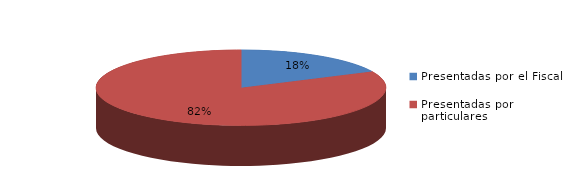
| Category | Series 0 |
|---|---|
| Presentadas por el Fiscal | 62 |
| Presentadas por particulares | 284 |